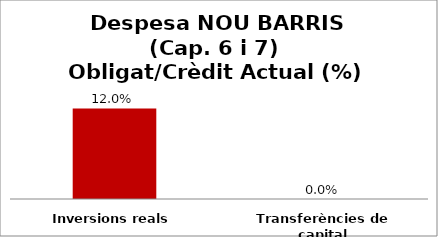
| Category | Series 0 |
|---|---|
| Inversions reals | 0.12 |
| Transferències de capital | 0 |